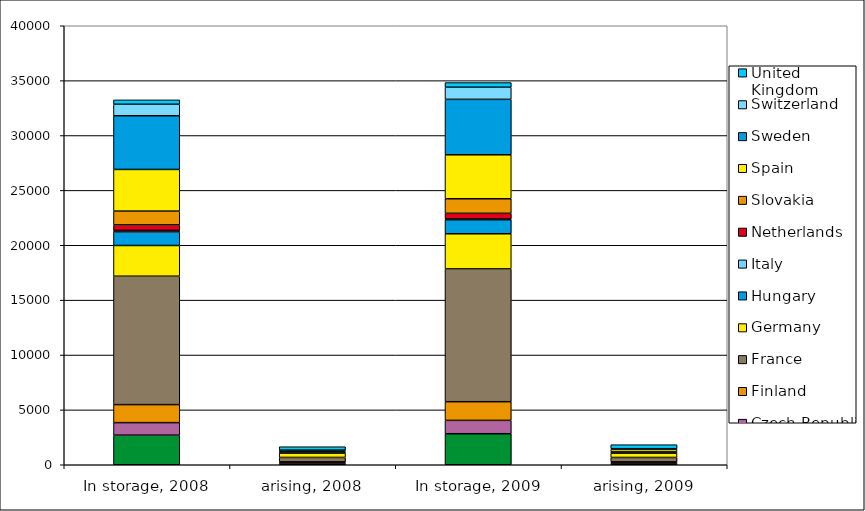
| Category | Belgium | Czech Republic | Finland | France | Germany | Hungary | Italy | Netherlands | Slovakia | Spain | Sweden | Switzerland | United Kingdom |
|---|---|---|---|---|---|---|---|---|---|---|---|---|---|
| In storage, 2008 | 2699 | 1138 | 1643 | 11700 | 2800 | 1233 | 143 | 500 | 1255 | 3797 | 4893 | 1046 | 398 |
| arising, 2008 | 125 | 79 | 63 | 400 | 400 | 48 | 0 | 8 | 75 | 76 | 0 | 60 | 309 |
| In storage, 2009 | 2827 | 1217 | 1703 | 12100 | 3200 | 1282 | 73 | 507 | 1328 | 4007 | 5051 | 1106 | 423 |
| arising, 2009 | 128 | 76 | 60 | 400 | 400 | 49 | 0 | 8 | 73 | 210 | 0 | 60 | 364 |